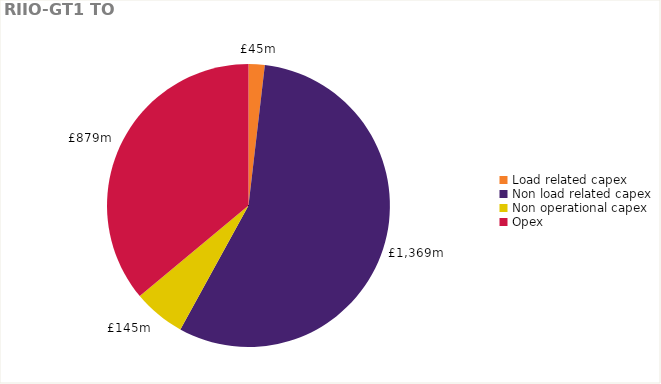
| Category | Series 0 |
|---|---|
| Load related capex | 45 |
| Non load related capex | 1369 |
| Non operational capex | 145 |
| Opex | 879 |